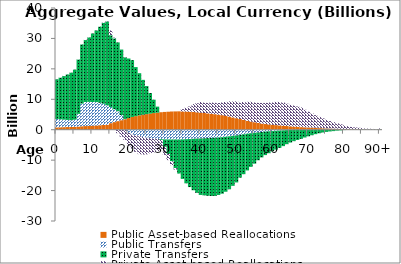
| Category | Public Asset-based Reallocations | Public Transfers | Private Transfers | Private Asset-based Reallocations |
|---|---|---|---|---|
| 0 | 769.189 | 2761.07 | 13060.949 | 51.109 |
|  | 805.877 | 2612.114 | 13683.931 | 53.547 |
| 2 | 843.288 | 2471.633 | 14319.174 | 56.033 |
| 3 | 881.566 | 2334.025 | 14969.134 | 58.576 |
| 4 | 920.82 | 2198.634 | 15635.68 | 61.185 |
| 5 | 970.055 | 2331.646 | 16471.682 | 64.466 |
| 6 | 1051.899 | 4158.291 | 17861.365 | 69.945 |
| 7 | 1145.936 | 7438.171 | 19458.074 | 76.244 |
| 8 | 1198.797 | 7911.596 | 20355.669 | 79.761 |
| 9 | 1247.769 | 7897.142 | 21187.214 | 83.015 |
| 10 | 1329.033 | 7778.636 | 22567.066 | 88.442 |
| 11 | 1388.533 | 7694.743 | 23577.387 | 92.388 |
| 12 | 1473.353 | 7379.372 | 25017.624 | 98.044 |
| 13 | 1563.733 | 6969.204 | 26551.869 | 104.482 |
| 14 | 1623.641 | 6406.766 | 27567.017 | 110.555 |
| 15 | 2151.488 | 5317.938 | 23588.045 | 1568.868 |
| 16 | 2495.877 | 4240.113 | 23290.98 | 244.049 |
| 17 | 2818.811 | 3260.972 | 22615.636 | -1121.345 |
| 18 | 3134.498 | 1683.959 | 21531.124 | -2309.399 |
| 19 | 3451.764 | 91.114 | 20226.146 | -3355.057 |
| 20 | 3823.929 | -1021.95 | 19582.638 | -4171.73 |
| 21 | 4203.125 | -1549.232 | 18679.902 | -4676.701 |
| 22 | 4460.284 | -1863.198 | 16120.299 | -5393.084 |
| 23 | 4722.921 | -2149.029 | 13847.46 | -5869.137 |
| 24 | 4922.085 | -2384.598 | 11468.613 | -5759.849 |
| 25 | 5110.273 | -2597.535 | 9234.193 | -5476.547 |
| 26 | 5295.396 | -2778.448 | 6760.722 | -4976.067 |
| 27 | 5470.797 | -2928.302 | 4404.104 | -4521.417 |
| 28 | 5616.016 | -3049.321 | 1973.274 | -3995.028 |
| 29 | 5746.891 | -3120.969 | -258.47 | -3189.575 |
| 30 | 5842.556 | -3182.198 | -2449.959 | -2647.442 |
| 31 | 5911.867 | -3202.414 | -4757.206 | -2031.187 |
| 32 | 5982.855 | -3217.627 | -7157.176 | -1283.105 |
| 33 | 6011.798 | -3209.713 | -9393.737 | -492.324 |
| 34 | 6037.886 | -3208.85 | -11217.696 | -46.591 |
| 35 | 6008.062 | -3175.153 | -12987.8 | 755.397 |
| 36 | 5974.862 | -3107.149 | -14514.181 | 1248.059 |
| 37 | 5920.667 | -3065.591 | -15787.087 | 1701.125 |
| 38 | 5812.526 | -2982.628 | -16918.022 | 2614.182 |
| 39 | 5720.083 | -2930.837 | -17823.686 | 2966.413 |
| 40 | 5611.343 | -2889.514 | -18547.34 | 3516.973 |
| 41 | 5500.764 | -2827.498 | -18747.516 | 3414.504 |
| 42 | 5374.782 | -2761.962 | -18949.908 | 3460.589 |
| 43 | 5235.021 | -2702.91 | -19071.487 | 3686.781 |
| 44 | 5110.329 | -2635.347 | -19129.373 | 3740.71 |
| 45 | 4955.075 | -2568.835 | -18873.284 | 3814.956 |
| 46 | 4778.824 | -2454.687 | -18572.344 | 4175.498 |
| 47 | 4561.573 | -2328.737 | -18051.954 | 4579.771 |
| 48 | 4315.426 | -2175.801 | -17403.652 | 4994.72 |
| 49 | 4043.691 | -2011.894 | -16439.603 | 5224.74 |
| 50 | 3783.952 | -1869.13 | -15457.507 | 5534.913 |
| 51 | 3506.849 | -1690.87 | -14067.469 | 5394.168 |
| 52 | 3216.344 | -1500.21 | -13114.173 | 5906.031 |
| 53 | 2938.228 | -1321.043 | -12055.916 | 6236.305 |
| 54 | 2677.599 | -1152.511 | -11053.959 | 6519.24 |
| 55 | 2455.943 | -1022.529 | -10138.184 | 6492.8 |
| 56 | 2224.787 | -874.385 | -9163.777 | 6610.638 |
| 57 | 2025.074 | -744.304 | -8359.778 | 6775.639 |
| 58 | 1866.441 | -623.405 | -7719.853 | 6958.062 |
| 59 | 1738.743 | -529.628 | -7191.837 | 7191.999 |
| 60 | 1625.618 | -446.808 | -6629.377 | 7316.317 |
| 61 | 1516.528 | -348.573 | -6198.132 | 7636.925 |
| 62 | 1417.549 | -274 | -5711.302 | 7693.591 |
| 63 | 1309.855 | -199.266 | -5196.515 | 7605.854 |
| 64 | 1207.725 | -131.192 | -4625.53 | 7350.325 |
| 65 | 1113.149 | -77.105 | -4140.572 | 7089.928 |
| 66 | 1024.148 | -24.742 | -3734.528 | 6932.899 |
| 67 | 940.836 | 13.694 | -3366.502 | 6685.334 |
| 68 | 849.708 | 54.894 | -3005.892 | 6410.321 |
| 69 | 791.366 | 55.241 | -2566.623 | 5704.778 |
| 70 | 723.33 | 76.121 | -2178.027 | 5129.279 |
| 71 | 656.475 | 89.022 | -1812.159 | 4593.121 |
| 72 | 586.719 | 99.357 | -1468.711 | 4119.283 |
| 73 | 526.709 | 106.162 | -1175.318 | 3598.37 |
| 74 | 469.729 | 109.776 | -914.789 | 3162.238 |
| 75 | 416.08 | 101.788 | -724.576 | 2763.835 |
| 76 | 366.168 | 96.597 | -572.015 | 2384.699 |
| 77 | 319.489 | 86.294 | -456.795 | 2077.592 |
| 78 | 273.921 | 78.196 | -305.225 | 1745.472 |
| 79 | 234.235 | 65.571 | -222.46 | 1488.29 |
| 80 | 196.658 | 52.596 | -117.871 | 1198.58 |
| 81 | 160.459 | 40.298 | -59.917 | 965.641 |
| 82 | 129.887 | 30.78 | -7.548 | 762.374 |
| 83 | 105.414 | 26.451 | 32.965 | 599.772 |
| 84 | 85.801 | 22.055 | 55.632 | 477.233 |
| 85 | 67.983 | 18.016 | 65.995 | 371.701 |
| 86 | 52.739 | 15.03 | 82.69 | 266.398 |
| 87 | 40.274 | 11.705 | 55.966 | 218.993 |
| 88 | 30.208 | 8.824 | 48.683 | 164.016 |
| 89 | 22.224 | 6.339 | 40.888 | 120.484 |
| 90+ | 49.424 | 13.685 | 102.528 | 267.519 |